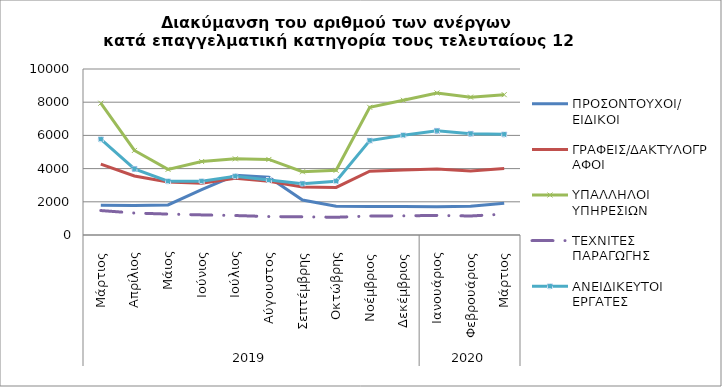
| Category | ΠΡΟΣΟΝΤΟΥΧΟΙ/  ΕΙΔΙΚΟΙ | ΓΡΑΦΕΙΣ/ΔΑΚΤΥΛΟΓΡΑΦΟΙ | ΥΠΑΛΛΗΛΟΙ ΥΠΗΡΕΣΙΩΝ | ΤΕΧΝΙΤΕΣ ΠΑΡΑΓΩΓΗΣ | ΑΝΕΙΔΙΚΕΥΤΟΙ ΕΡΓΑΤΕΣ |
|---|---|---|---|---|---|
| 0 | 1798 | 4271 | 7939 | 1473 | 5771 |
| 1 | 1782 | 3556 | 5094 | 1323 | 3981 |
| 2 | 1813 | 3199 | 3952 | 1260 | 3240 |
| 3 | 2731 | 3112 | 4425 | 1211 | 3242 |
| 4 | 3596 | 3417 | 4589 | 1173 | 3539 |
| 5 | 3481 | 3236 | 4551 | 1111 | 3312 |
| 6 | 2104 | 2890 | 3809 | 1097 | 3094 |
| 7 | 1735 | 2865 | 3896 | 1068 | 3242 |
| 8 | 1719 | 3843 | 7692 | 1144 | 5690 |
| 9 | 1724 | 3914 | 8117 | 1155 | 6012 |
| 10 | 1702 | 3980 | 8556 | 1179 | 6279 |
| 11 | 1728 | 3859 | 8305 | 1145 | 6104 |
| 12 | 1918 | 4001 | 8454 | 1258 | 6062 |